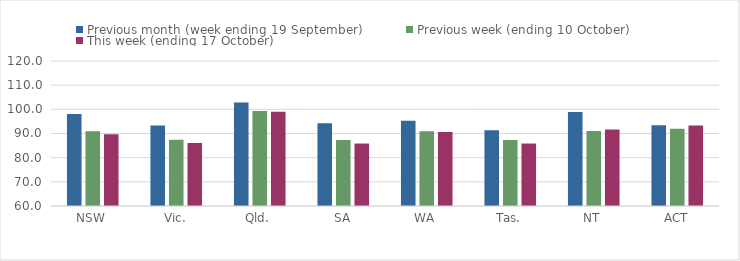
| Category | Previous month (week ending 19 September) | Previous week (ending 10 October) | This week (ending 17 October) |
|---|---|---|---|
| NSW | 98.09 | 90.92 | 89.7 |
| Vic. | 93.33 | 87.44 | 86.06 |
| Qld. | 102.86 | 99.34 | 99.05 |
| SA | 94.2 | 87.29 | 85.85 |
| WA | 95.23 | 90.95 | 90.65 |
| Tas. | 91.39 | 87.26 | 85.85 |
| NT | 98.9 | 91.08 | 91.67 |
| ACT | 93.4 | 91.98 | 93.34 |